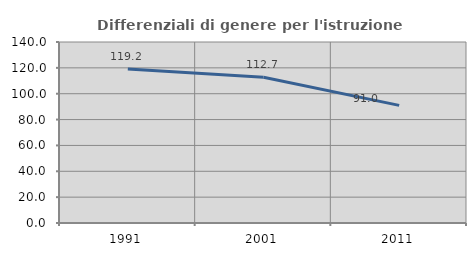
| Category | Differenziali di genere per l'istruzione superiore |
|---|---|
| 1991.0 | 119.2 |
| 2001.0 | 112.668 |
| 2011.0 | 90.997 |